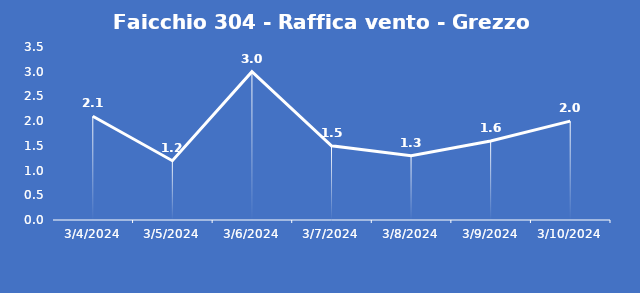
| Category | Faicchio 304 - Raffica vento - Grezzo (m/s) |
|---|---|
| 3/4/24 | 2.1 |
| 3/5/24 | 1.2 |
| 3/6/24 | 3 |
| 3/7/24 | 1.5 |
| 3/8/24 | 1.3 |
| 3/9/24 | 1.6 |
| 3/10/24 | 2 |